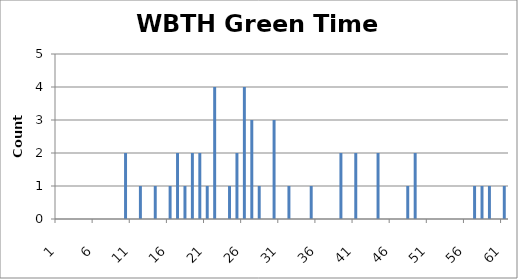
| Category | Series 0 |
|---|---|
| 0 | 0 |
| 1 | 0 |
| 2 | 0 |
| 3 | 0 |
| 4 | 0 |
| 5 | 0 |
| 6 | 0 |
| 7 | 0 |
| 8 | 0 |
| 9 | 2 |
| 10 | 0 |
| 11 | 1 |
| 12 | 0 |
| 13 | 1 |
| 14 | 0 |
| 15 | 1 |
| 16 | 2 |
| 17 | 1 |
| 18 | 2 |
| 19 | 2 |
| 20 | 1 |
| 21 | 4 |
| 22 | 0 |
| 23 | 1 |
| 24 | 2 |
| 25 | 4 |
| 26 | 3 |
| 27 | 1 |
| 28 | 0 |
| 29 | 3 |
| 30 | 0 |
| 31 | 1 |
| 32 | 0 |
| 33 | 0 |
| 34 | 1 |
| 35 | 0 |
| 36 | 0 |
| 37 | 0 |
| 38 | 2 |
| 39 | 0 |
| 40 | 2 |
| 41 | 0 |
| 42 | 0 |
| 43 | 2 |
| 44 | 0 |
| 45 | 0 |
| 46 | 0 |
| 47 | 1 |
| 48 | 2 |
| 49 | 0 |
| 50 | 0 |
| 51 | 0 |
| 52 | 0 |
| 53 | 0 |
| 54 | 0 |
| 55 | 0 |
| 56 | 1 |
| 57 | 1 |
| 58 | 1 |
| 59 | 0 |
| 60 | 1 |